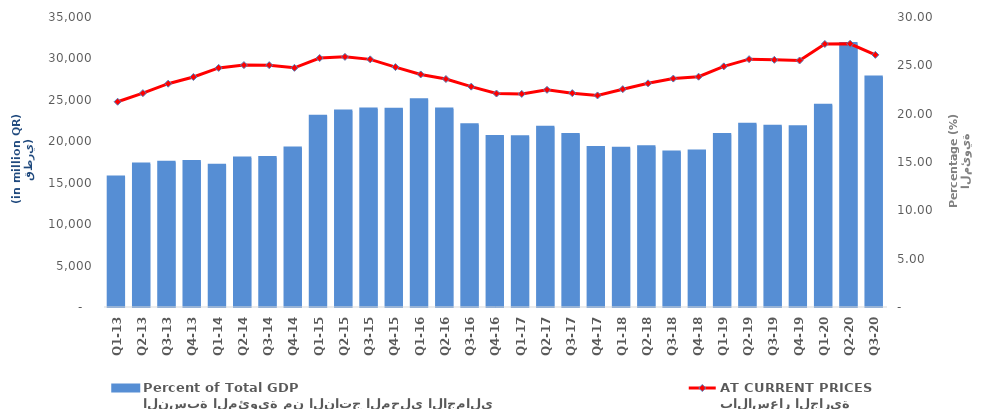
| Category | النسبة المئوية من الناتج المحلي الاجمالي
Percent of Total GDP |
|---|---|
| Q1-13 | 13.436 |
| Q2-13 | 14.783 |
| Q3-13 | 14.97 |
| Q4-13 | 15.057 |
| Q1-14 | 14.657 |
| Q2-14 | 15.418 |
| Q3-14 | 15.458 |
| Q4-14 | 16.438 |
| Q1-15 | 19.732 |
| Q2-15 | 20.281 |
| Q3-15 | 20.478 |
| Q4-15 | 20.445 |
| Q1-16 | 21.442 |
| Q2-16 | 20.486 |
| Q3-16 | 18.851 |
| Q4-16 | 17.645 |
| Q1-17 | 17.618 |
| Q2-17 | 18.595 |
| Q3-17 | 17.85 |
| Q4-17 | 16.487 |
| Q1-18 | 16.415 |
| Q2-18 | 16.566 |
| Q3-18 | 16.037 |
| Q4-18 | 16.131 |
| Q1-19 | 17.85 |
| Q2-19 | 18.914 |
| Q3-19 | 18.696 |
| Q4-19 | 18.636 |
| Q1-20 | 20.863 |
| Q2-20 | 27.249 |
| Q3-20 | 23.803 |